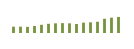
| Category | Saldo [ (1)-(2) ] |
|---|---|
| 0 | 203117.024 |
| 1 | 204244.864 |
| 2 | 198400.412 |
| 3 | 227324.117 |
| 4 | 264760.339 |
| 5 | 296419.004 |
| 6 | 312165.442 |
| 7 | 318321.614 |
| 8 | 312463.312 |
| 9 | 291587.274 |
| 10 | 334649.348 |
| 11 | 344816.778 |
| 12 | 363008.511 |
| 13 | 460327.444 |
| 14 | 495580.342 |
| 15 | 518438.166 |